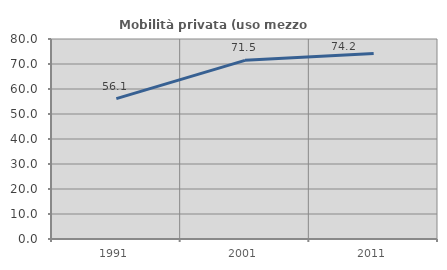
| Category | Mobilità privata (uso mezzo privato) |
|---|---|
| 1991.0 | 56.149 |
| 2001.0 | 71.452 |
| 2011.0 | 74.153 |